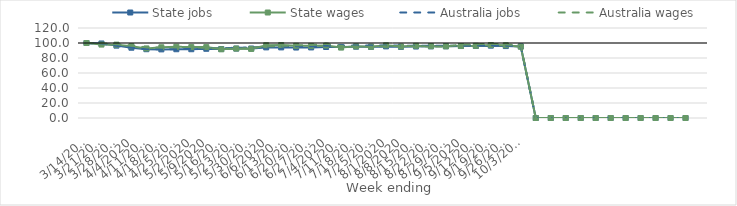
| Category | State jobs | State wages | Australia jobs | Australia wages |
|---|---|---|---|---|
| 14/03/2020 | 100 | 100 | 100 | 100 |
| 21/03/2020 | 99.355 | 97.892 | 99.271 | 99.673 |
| 28/03/2020 | 96.494 | 97.828 | 96.296 | 98.402 |
| 04/04/2020 | 93.723 | 95.75 | 93.638 | 96.698 |
| 11/04/2020 | 91.726 | 92.766 | 91.923 | 94.162 |
| 18/04/2020 | 91.495 | 94.277 | 91.471 | 94.06 |
| 25/04/2020 | 91.679 | 95.001 | 91.807 | 94.247 |
| 02/05/2020 | 91.707 | 94.516 | 92.206 | 94.699 |
| 09/05/2020 | 92.286 | 94.516 | 92.756 | 93.319 |
| 16/05/2020 | 91.939 | 91.621 | 93.289 | 92.663 |
| 23/05/2020 | 92.579 | 92.577 | 93.593 | 92.285 |
| 30/05/2020 | 92.617 | 92.122 | 94.094 | 93.58 |
| 06/06/2020 | 94.16 | 97.026 | 95.016 | 95.453 |
| 13/06/2020 | 94.138 | 97.329 | 95.471 | 96.086 |
| 20/06/2020 | 93.943 | 96.315 | 95.658 | 97.003 |
| 27/06/2020 | 94.097 | 96.18 | 95.603 | 97.208 |
| 04/07/2020 | 94.651 | 96.657 | 96.357 | 98.944 |
| 11/07/2020 | 94.572 | 93.899 | 96.686 | 95.884 |
| 18/07/2020 | 95.088 | 95.556 | 96.562 | 95.403 |
| 25/07/2020 | 94.91 | 95.058 | 96.622 | 95.053 |
| 01/08/2020 | 95.467 | 96.903 | 96.719 | 95.78 |
| 08/08/2020 | 94.862 | 95.33 | 96.574 | 96.121 |
| 15/08/2020 | 95.286 | 96.33 | 96.402 | 95.627 |
| 22/08/2020 | 95.529 | 95.781 | 96.279 | 95.418 |
| 29/08/2020 | 95.598 | 95.618 | 96.2 | 95.474 |
| 05/09/2020 | 95.947 | 95.983 | 96.273 | 97.682 |
| 12/09/2020 | 96.05 | 96.305 | 96.568 | 98.358 |
| 19/09/2020 | 96.445 | 97.303 | 96.733 | 98.934 |
| 26/09/2020 | 95.916 | 97.015 | 96.519 | 98.073 |
| 03/10/2020 | 95.453 | 95.077 | 95.865 | 96.714 |